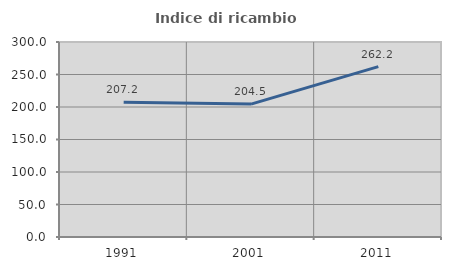
| Category | Indice di ricambio occupazionale  |
|---|---|
| 1991.0 | 207.246 |
| 2001.0 | 204.494 |
| 2011.0 | 262.195 |